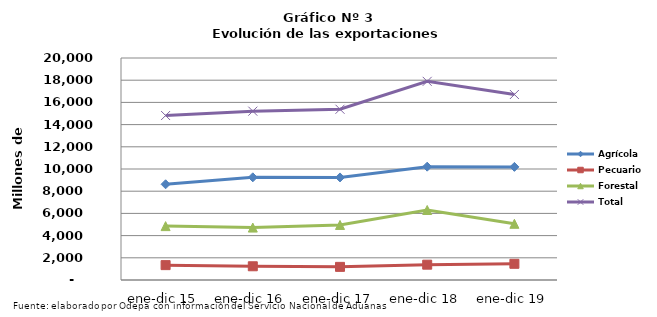
| Category | Agrícola | Pecuario | Forestal | Total |
|---|---|---|---|---|
| ene-dic 15 | 8623933 | 1338945 | 4854159 | 14817037 |
| ene-dic 16 | 9250572 | 1236616 | 4722907 | 15210095 |
| ene-dic 17 | 9238481 | 1182554 | 4960800 | 15381835 |
| ene-dic 18 | 10209380 | 1380778 | 6307561 | 17897719 |
| ene-dic 19 | 10190231 | 1458841 | 5063823 | 16712895 |